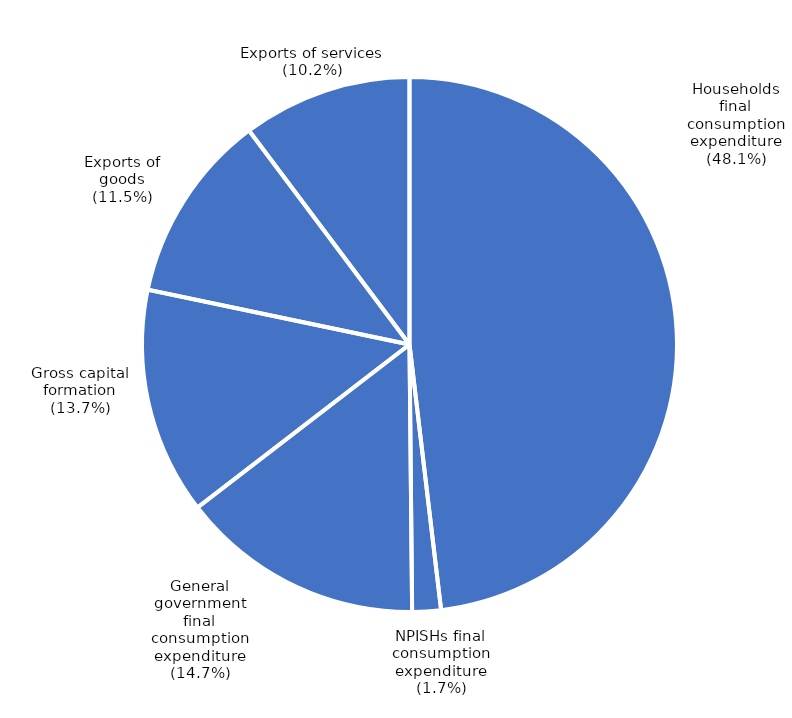
| Category | Series 0 |
|---|---|
| Households
final
consumption
expenditure | 1248091 |
| NPISHs final
consumption
expenditure | 44859 |
| General
government
final
consumption
expenditure | 381987 |
| Gross capital
formation | 355888 |
| Exports of
goods | 297555 |
| Exports of services | 265693 |